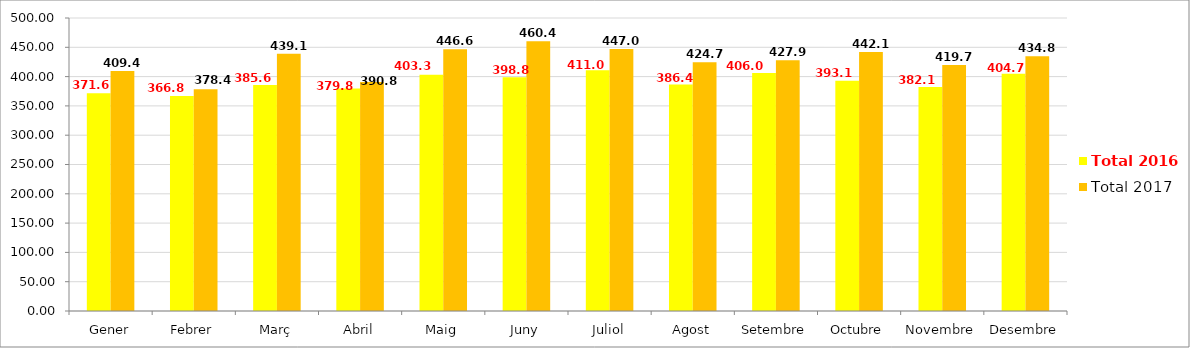
| Category | Total 2016 | Total 2017 |
|---|---|---|
| Gener | 371.62 | 409.42 |
| Febrer | 366.84 | 378.48 |
| Març | 385.68 | 439.16 |
| Abril | 379.84 | 390.82 |
| Maig | 403.32 | 446.66 |
| Juny | 398.86 | 460.46 |
| Juliol | 411.04 | 447 |
| Agost | 386.4 | 424.7 |
| Setembre | 406 | 427.9 |
| Octubre | 393.1 | 442.179 |
| Novembre | 382.181 | 419.76 |
| Desembre | 404.76 | 434.88 |